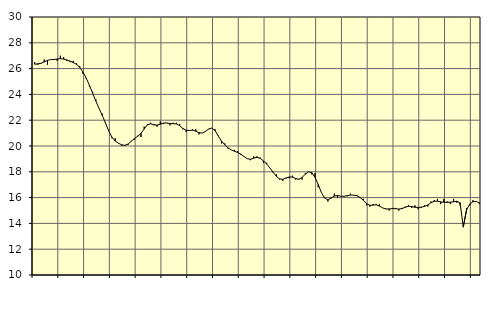
| Category | Piggar | Tillverkning o utvinning, energi o miljö, SNI 05-33, 35-391 |
|---|---|---|
| nan | 26.5 | 26.34 |
| 87.0 | 26.3 | 26.37 |
| 87.0 | 26.4 | 26.41 |
| 87.0 | 26.7 | 26.52 |
| nan | 26.3 | 26.64 |
| 88.0 | 26.7 | 26.7 |
| 88.0 | 26.7 | 26.71 |
| 88.0 | 26.6 | 26.74 |
| nan | 27 | 26.77 |
| 89.0 | 26.9 | 26.74 |
| 89.0 | 26.6 | 26.67 |
| 89.0 | 26.5 | 26.58 |
| nan | 26.6 | 26.47 |
| 90.0 | 26.4 | 26.33 |
| 90.0 | 26.2 | 26.1 |
| 90.0 | 25.6 | 25.74 |
| nan | 25.2 | 25.27 |
| 91.0 | 24.6 | 24.71 |
| 91.0 | 24.2 | 24.1 |
| 91.0 | 23.6 | 23.48 |
| nan | 22.9 | 22.91 |
| 92.0 | 22.5 | 22.37 |
| 92.0 | 21.8 | 21.77 |
| 92.0 | 21.2 | 21.16 |
| nan | 20.6 | 20.68 |
| 93.0 | 20.6 | 20.38 |
| 93.0 | 20.2 | 20.22 |
| 93.0 | 20 | 20.09 |
| nan | 20 | 20.05 |
| 94.0 | 20.1 | 20.15 |
| 94.0 | 20.4 | 20.37 |
| 94.0 | 20.5 | 20.58 |
| nan | 20.8 | 20.75 |
| 95.0 | 20.7 | 20.98 |
| 95.0 | 21.5 | 21.32 |
| 95.0 | 21.7 | 21.64 |
| nan | 21.8 | 21.72 |
| 96.0 | 21.6 | 21.65 |
| 96.0 | 21.5 | 21.62 |
| 96.0 | 21.9 | 21.69 |
| nan | 21.7 | 21.78 |
| 97.0 | 21.8 | 21.78 |
| 97.0 | 21.6 | 21.74 |
| 97.0 | 21.8 | 21.73 |
| nan | 21.8 | 21.71 |
| 98.0 | 21.7 | 21.58 |
| 98.0 | 21.3 | 21.36 |
| 98.0 | 21.1 | 21.22 |
| nan | 21.2 | 21.2 |
| 99.0 | 21.3 | 21.23 |
| 99.0 | 21.3 | 21.15 |
| 99.0 | 20.9 | 21.03 |
| nan | 21 | 21 |
| 0.0 | 21.1 | 21.13 |
| 0.0 | 21.3 | 21.32 |
| 0.0 | 21.4 | 21.39 |
| nan | 21.3 | 21.19 |
| 1.0 | 20.8 | 20.77 |
| 1.0 | 20.2 | 20.38 |
| 1.0 | 20.2 | 20.09 |
| nan | 19.8 | 19.86 |
| 2.0 | 19.7 | 19.7 |
| 2.0 | 19.7 | 19.59 |
| 2.0 | 19.6 | 19.5 |
| nan | 19.3 | 19.36 |
| 3.0 | 19.2 | 19.18 |
| 3.0 | 19 | 19.01 |
| 3.0 | 18.9 | 18.97 |
| nan | 19.2 | 19.06 |
| 4.0 | 19.2 | 19.12 |
| 4.0 | 19.1 | 19.04 |
| 4.0 | 18.7 | 18.85 |
| nan | 18.7 | 18.6 |
| 5.0 | 18.3 | 18.3 |
| 5.0 | 18 | 17.96 |
| 5.0 | 17.8 | 17.65 |
| nan | 17.4 | 17.45 |
| 6.0 | 17.3 | 17.42 |
| 6.0 | 17.5 | 17.52 |
| 6.0 | 17.5 | 17.6 |
| nan | 17.7 | 17.59 |
| 7.0 | 17.4 | 17.48 |
| 7.0 | 17.4 | 17.42 |
| 7.0 | 17.4 | 17.57 |
| nan | 17.9 | 17.82 |
| 8.0 | 18 | 18 |
| 8.0 | 17.8 | 17.93 |
| 8.0 | 17.9 | 17.57 |
| nan | 16.8 | 17.01 |
| 9.0 | 16.4 | 16.38 |
| 9.0 | 16 | 15.96 |
| 9.0 | 15.7 | 15.84 |
| nan | 16 | 15.96 |
| 10.0 | 16.3 | 16.12 |
| 10.0 | 16 | 16.16 |
| 10.0 | 16.1 | 16.11 |
| nan | 16.1 | 16.1 |
| 11.0 | 16.1 | 16.15 |
| 11.0 | 16.3 | 16.2 |
| 11.0 | 16.2 | 16.19 |
| nan | 16.2 | 16.14 |
| 12.0 | 16 | 16.01 |
| 12.0 | 15.9 | 15.79 |
| 12.0 | 15.4 | 15.53 |
| nan | 15.3 | 15.4 |
| 13.0 | 15.5 | 15.42 |
| 13.0 | 15.5 | 15.44 |
| 13.0 | 15.5 | 15.34 |
| nan | 15.2 | 15.2 |
| 14.0 | 15.1 | 15.12 |
| 14.0 | 15 | 15.12 |
| 14.0 | 15.2 | 15.15 |
| nan | 15.2 | 15.14 |
| 15.0 | 15 | 15.11 |
| 15.0 | 15.2 | 15.15 |
| 15.0 | 15.3 | 15.25 |
| nan | 15.4 | 15.33 |
| 16.0 | 15.2 | 15.31 |
| 16.0 | 15.4 | 15.25 |
| 16.0 | 15.1 | 15.24 |
| nan | 15.2 | 15.26 |
| 17.0 | 15.4 | 15.32 |
| 17.0 | 15.3 | 15.43 |
| 17.0 | 15.7 | 15.6 |
| nan | 15.8 | 15.72 |
| 18.0 | 15.9 | 15.72 |
| 18.0 | 15.5 | 15.67 |
| 18.0 | 15.9 | 15.64 |
| nan | 15.7 | 15.63 |
| 19.0 | 15.5 | 15.65 |
| 19.0 | 15.9 | 15.67 |
| 19.0 | 15.6 | 15.72 |
| nan | 15.4 | 15.6 |
| 20.0 | 13.7 | 13.72 |
| 20.0 | 15.2 | 15.03 |
| 20.0 | 15.4 | 15.51 |
| nan | 15.8 | 15.68 |
| 21.0 | 15.7 | 15.7 |
| 21.0 | 15.5 | 15.6 |